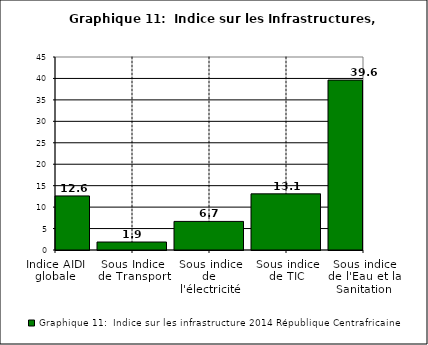
| Category | Graphique 11:  Indice sur les infrastructure 2014 |
|---|---|
| Indice AIDI globale | 12.603 |
| Sous Indice de Transport | 1.859 |
| Sous indice de l'électricité | 6.667 |
| Sous indice de TIC | 13.092 |
| Sous indice de l'Eau et la Sanitation | 39.617 |